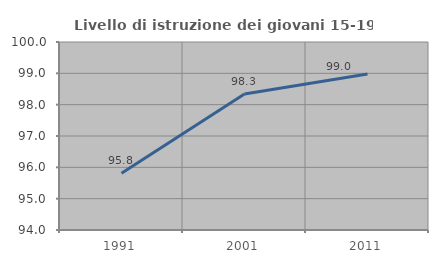
| Category | Livello di istruzione dei giovani 15-19 anni |
|---|---|
| 1991.0 | 95.815 |
| 2001.0 | 98.34 |
| 2011.0 | 98.98 |